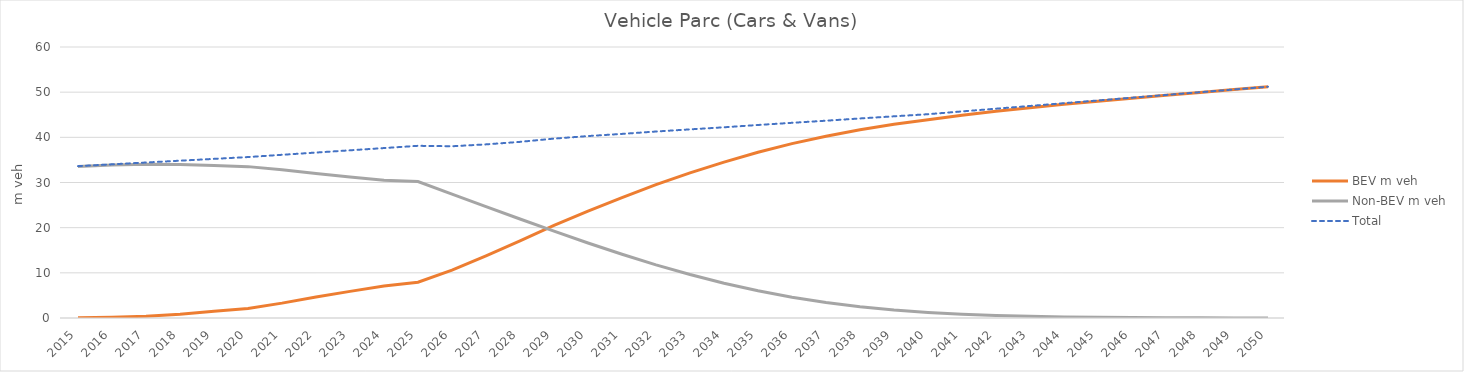
| Category | BEV | Non-BEV | Total |
|---|---|---|---|
| 2015.0 | 0.073 | 33.55 | 33.623 |
| 2016.0 | 0.167 | 33.859 | 34.026 |
| 2017.0 | 0.4 | 34.028 | 34.428 |
| 2018.0 | 0.848 | 33.983 | 34.83 |
| 2019.0 | 1.476 | 33.756 | 35.233 |
| 2020.0 | 2.12 | 33.514 | 35.634 |
| 2021.0 | 3.294 | 32.838 | 36.132 |
| 2022.0 | 4.64 | 31.99 | 36.63 |
| 2023.0 | 5.896 | 31.232 | 37.127 |
| 2024.0 | 7.107 | 30.518 | 37.625 |
| 2025.0 | 7.922 | 30.2 | 38.122 |
| 2026.0 | 10.578 | 27.445 | 38.023 |
| 2027.0 | 13.766 | 24.676 | 38.442 |
| 2028.0 | 17.073 | 21.923 | 38.996 |
| 2029.0 | 20.495 | 19.221 | 39.716 |
| 2030.0 | 23.678 | 16.604 | 40.281 |
| 2031.0 | 26.65 | 14.109 | 40.759 |
| 2032.0 | 29.516 | 11.772 | 41.289 |
| 2033.0 | 32.134 | 9.628 | 41.761 |
| 2034.0 | 34.517 | 7.705 | 42.222 |
| 2035.0 | 36.709 | 6.026 | 42.735 |
| 2036.0 | 38.613 | 4.601 | 43.214 |
| 2037.0 | 40.255 | 3.428 | 43.683 |
| 2038.0 | 41.687 | 2.492 | 44.179 |
| 2039.0 | 42.883 | 1.77 | 44.653 |
| 2040.0 | 43.892 | 1.23 | 45.122 |
| 2041.0 | 44.899 | 0.838 | 45.737 |
| 2042.0 | 45.781 | 0.562 | 46.343 |
| 2043.0 | 46.575 | 0.372 | 46.947 |
| 2044.0 | 47.317 | 0.244 | 47.561 |
| 2045.0 | 48.007 | 0.158 | 48.165 |
| 2046.0 | 48.669 | 0.102 | 48.771 |
| 2047.0 | 49.318 | 0.066 | 49.383 |
| 2048.0 | 49.946 | 0.042 | 49.988 |
| 2049.0 | 50.568 | 0.027 | 50.595 |
| 2050.0 | 51.188 | 0.017 | 51.206 |